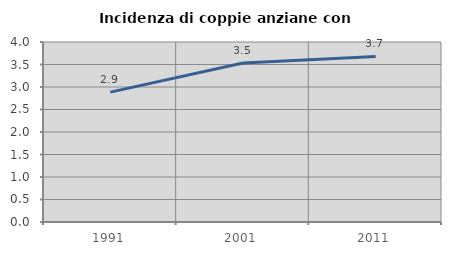
| Category | Incidenza di coppie anziane con figli |
|---|---|
| 1991.0 | 2.887 |
| 2001.0 | 3.535 |
| 2011.0 | 3.68 |